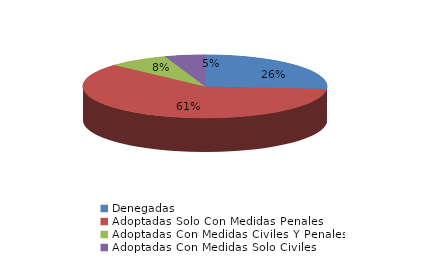
| Category | Series 0 |
|---|---|
| Denegadas | 10 |
| Adoptadas Solo Con Medidas Penales | 23 |
| Adoptadas Con Medidas Civiles Y Penales | 3 |
| Adoptadas Con Medidas Solo Civiles | 2 |